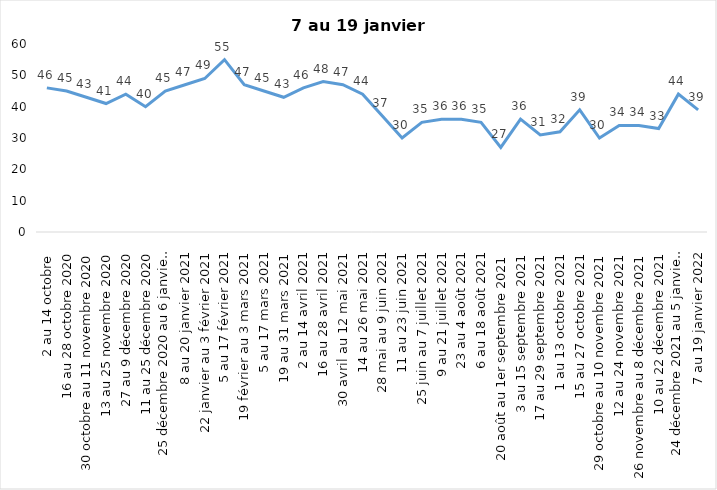
| Category | Toujours aux trois mesures |
|---|---|
| 2 au 14 octobre  | 46 |
| 16 au 28 octobre 2020 | 45 |
| 30 octobre au 11 novembre 2020 | 43 |
| 13 au 25 novembre 2020 | 41 |
| 27 au 9 décembre 2020 | 44 |
| 11 au 25 décembre 2020 | 40 |
| 25 décembre 2020 au 6 janvier 2021 | 45 |
| 8 au 20 janvier 2021 | 47 |
| 22 janvier au 3 février 2021 | 49 |
| 5 au 17 février 2021 | 55 |
| 19 février au 3 mars 2021 | 47 |
| 5 au 17 mars 2021 | 45 |
| 19 au 31 mars 2021 | 43 |
| 2 au 14 avril 2021 | 46 |
| 16 au 28 avril 2021 | 48 |
| 30 avril au 12 mai 2021 | 47 |
| 14 au 26 mai 2021 | 44 |
| 28 mai au 9 juin 2021 | 37 |
| 11 au 23 juin 2021 | 30 |
| 25 juin au 7 juillet 2021 | 35 |
| 9 au 21 juillet 2021 | 36 |
| 23 au 4 août 2021 | 36 |
| 6 au 18 août 2021 | 35 |
| 20 août au 1er septembre 2021 | 27 |
| 3 au 15 septembre 2021 | 36 |
| 17 au 29 septembre 2021 | 31 |
| 1 au 13 octobre 2021 | 32 |
| 15 au 27 octobre 2021 | 39 |
| 29 octobre au 10 novembre 2021 | 30 |
| 12 au 24 novembre 2021 | 34 |
| 26 novembre au 8 décembre 2021 | 34 |
| 10 au 22 décembre 2021 | 33 |
| 24 décembre 2021 au 5 janvier 2022 2022 | 44 |
| 7 au 19 janvier 2022 | 39 |